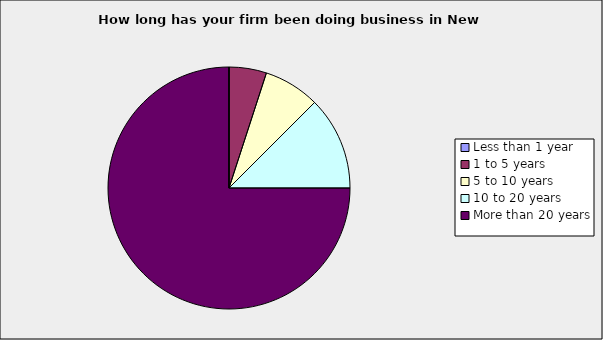
| Category | Series 0 |
|---|---|
| Less than 1 year | 0 |
| 1 to 5 years | 0.05 |
| 5 to 10 years | 0.075 |
| 10 to 20 years | 0.125 |
| More than 20 years | 0.75 |